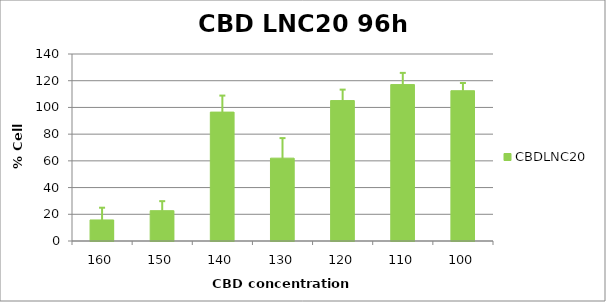
| Category | CBDLNC20 |
|---|---|
| 160.0 | 15.747 |
| 150.0 | 22.686 |
| 140.0 | 96.499 |
| 130.0 | 62.024 |
| 120.0 | 105.133 |
| 110.0 | 117.105 |
| 100.0 | 112.509 |